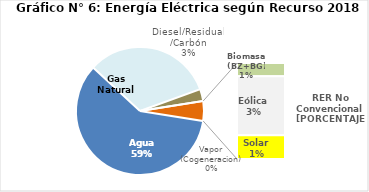
| Category | Series 0 |
|---|---|
| Agua | 2766.573 |
| Gas Natural | 1518.266 |
| Diesel/Residual/Carbón | 139.867 |
| Vapor (Cogeneracion) | 0.312 |
| Biomasa (BZ+BG) | 32.299 |
| Eólica | 143.404 |
| Solar | 57.905 |